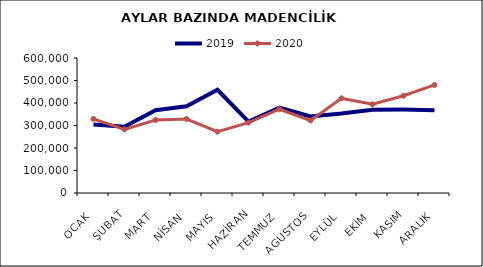
| Category | 2019 | 2020 |
|---|---|---|
| OCAK | 304008.428 | 329222.773 |
| ŞUBAT | 294499.689 | 282564.321 |
| MART | 368202.372 | 324512.098 |
| NİSAN | 385406.8 | 328934.36 |
| MAYIS | 458634.298 | 272471.243 |
| HAZİRAN | 317511.665 | 312612.13 |
| TEMMUZ | 379020.891 | 372336.745 |
| AGUSTOS | 340264.702 | 322428.475 |
| EYLÜL | 353396.994 | 420729.836 |
| EKİM | 370443.195 | 394133.515 |
| KASIM | 370700.387 | 432245.45 |
| ARALIK | 368116.692 | 480200.45 |